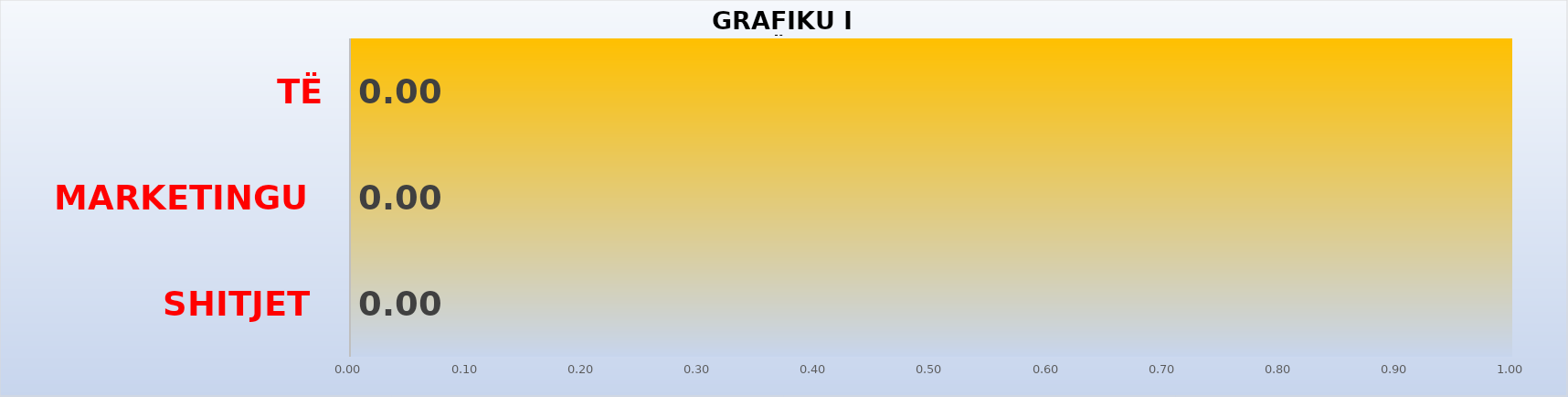
| Category | Series 0 |
|---|---|
| SHITJET | 0 |
| MARKETINGU | 0 |
| TË PËRGJITHSHME | 0 |